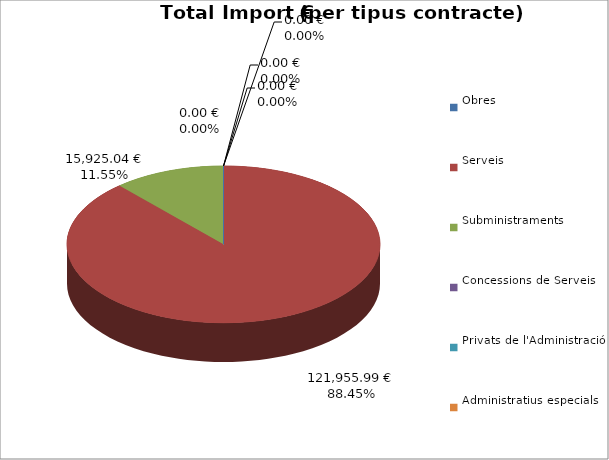
| Category | Total preu
(amb IVA) |
|---|---|
| Obres | 0 |
| Serveis | 121955.99 |
| Subministraments | 15925.04 |
| Concessions de Serveis | 0 |
| Privats de l'Administració | 0 |
| Administratius especials | 0 |